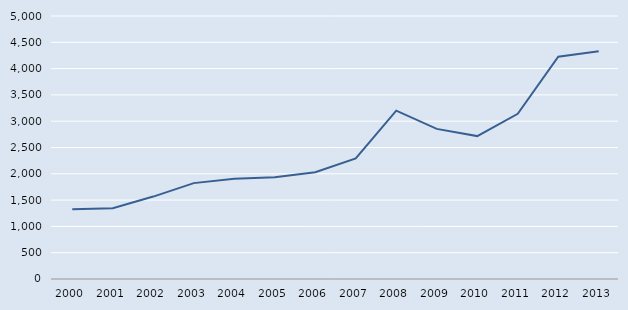
| Category | Series 0 |
|---|---|
| 2000.0 | 1324 |
| 2001.0 | 1347 |
| 2002.0 | 1567 |
| 2003.0 | 1823 |
| 2004.0 | 1907 |
| 2005.0 | 1934 |
| 2006.0 | 2030 |
| 2007.0 | 2293 |
| 2008.0 | 3200 |
| 2009.0 | 2854 |
| 2010.0 | 2717 |
| 2011.0 | 3140 |
| 2012.0 | 4227 |
| 2013.0 | 4332 |